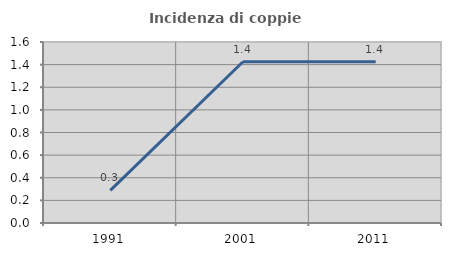
| Category | Incidenza di coppie miste |
|---|---|
| 1991.0 | 0.288 |
| 2001.0 | 1.425 |
| 2011.0 | 1.425 |